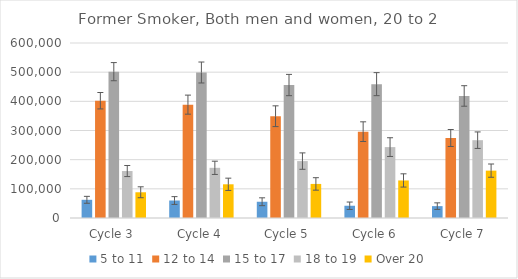
| Category | 5 to 11 | 12 to 14 | 15 to 17 | 18 to 19 | Over 20 |
|---|---|---|---|---|---|
| Cycle 3 | 62377 | 402105 | 501717 | 161028 | 88213 |
| Cycle 4 | 59937 | 388672 | 498875 | 172063 | 115558 |
| Cycle 5 | 55702 | 348959 | 455867 | 195124 | 116802 |
| Cycle 6 | 42031 | 296008 | 458923 | 243082 | 128756 |
| Cycle 7 | 40694 | 274321 | 418449 | 266810 | 162403 |